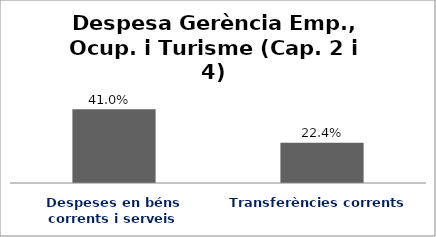
| Category | Series 0 |
|---|---|
| Despeses en béns corrents i serveis | 0.41 |
| Transferències corrents | 0.224 |